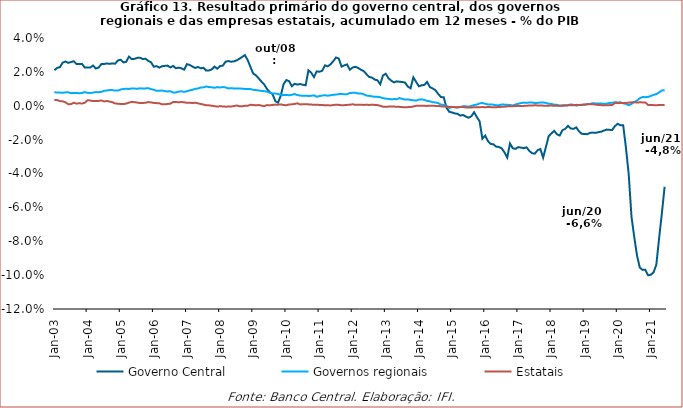
| Category | Governo Central | Governos regionais | Estatais |
|---|---|---|---|
| 2003-01-01 | 0.021 | 0.008 | 0.003 |
| 2003-02-01 | 0.022 | 0.008 | 0.003 |
| 2003-03-01 | 0.023 | 0.008 | 0.003 |
| 2003-04-01 | 0.025 | 0.008 | 0.003 |
| 2003-05-01 | 0.026 | 0.008 | 0.002 |
| 2003-06-01 | 0.025 | 0.008 | 0.001 |
| 2003-07-01 | 0.026 | 0.007 | 0.001 |
| 2003-08-01 | 0.026 | 0.008 | 0.002 |
| 2003-09-01 | 0.025 | 0.008 | 0.001 |
| 2003-10-01 | 0.025 | 0.007 | 0.001 |
| 2003-11-01 | 0.025 | 0.008 | 0.001 |
| 2003-12-01 | 0.023 | 0.008 | 0.002 |
| 2004-01-01 | 0.023 | 0.008 | 0.003 |
| 2004-02-01 | 0.023 | 0.008 | 0.003 |
| 2004-03-01 | 0.024 | 0.008 | 0.003 |
| 2004-04-01 | 0.022 | 0.008 | 0.003 |
| 2004-05-01 | 0.023 | 0.008 | 0.003 |
| 2004-06-01 | 0.025 | 0.008 | 0.003 |
| 2004-07-01 | 0.025 | 0.009 | 0.003 |
| 2004-08-01 | 0.025 | 0.009 | 0.003 |
| 2004-09-01 | 0.025 | 0.009 | 0.002 |
| 2004-10-01 | 0.025 | 0.009 | 0.002 |
| 2004-11-01 | 0.025 | 0.009 | 0.001 |
| 2004-12-01 | 0.027 | 0.009 | 0.001 |
| 2005-01-01 | 0.027 | 0.01 | 0.001 |
| 2005-02-01 | 0.026 | 0.01 | 0.001 |
| 2005-03-01 | 0.026 | 0.01 | 0.001 |
| 2005-04-01 | 0.029 | 0.01 | 0.002 |
| 2005-05-01 | 0.028 | 0.01 | 0.002 |
| 2005-06-01 | 0.028 | 0.01 | 0.002 |
| 2005-07-01 | 0.028 | 0.01 | 0.002 |
| 2005-08-01 | 0.028 | 0.01 | 0.002 |
| 2005-09-01 | 0.028 | 0.01 | 0.002 |
| 2005-10-01 | 0.028 | 0.01 | 0.002 |
| 2005-11-01 | 0.027 | 0.01 | 0.002 |
| 2005-12-01 | 0.026 | 0.01 | 0.002 |
| 2006-01-01 | 0.023 | 0.009 | 0.002 |
| 2006-02-01 | 0.023 | 0.009 | 0.002 |
| 2006-03-01 | 0.023 | 0.009 | 0.002 |
| 2006-04-01 | 0.023 | 0.009 | 0.001 |
| 2006-05-01 | 0.024 | 0.009 | 0.001 |
| 2006-06-01 | 0.024 | 0.008 | 0.001 |
| 2006-07-01 | 0.023 | 0.009 | 0.001 |
| 2006-08-01 | 0.024 | 0.008 | 0.002 |
| 2006-09-01 | 0.022 | 0.008 | 0.002 |
| 2006-10-01 | 0.023 | 0.008 | 0.002 |
| 2006-11-01 | 0.022 | 0.009 | 0.002 |
| 2006-12-01 | 0.021 | 0.008 | 0.002 |
| 2007-01-01 | 0.025 | 0.009 | 0.002 |
| 2007-02-01 | 0.024 | 0.009 | 0.002 |
| 2007-03-01 | 0.023 | 0.009 | 0.002 |
| 2007-04-01 | 0.022 | 0.01 | 0.002 |
| 2007-05-01 | 0.023 | 0.01 | 0.001 |
| 2007-06-01 | 0.022 | 0.011 | 0.001 |
| 2007-07-01 | 0.022 | 0.011 | 0.001 |
| 2007-08-01 | 0.021 | 0.011 | 0 |
| 2007-09-01 | 0.021 | 0.011 | 0 |
| 2007-10-01 | 0.021 | 0.011 | 0 |
| 2007-11-01 | 0.023 | 0.011 | 0 |
| 2007-12-01 | 0.022 | 0.011 | 0 |
| 2008-01-01 | 0.023 | 0.011 | 0 |
| 2008-02-01 | 0.024 | 0.011 | 0 |
| 2008-03-01 | 0.026 | 0.011 | -0.001 |
| 2008-04-01 | 0.026 | 0.01 | -0.001 |
| 2008-05-01 | 0.026 | 0.01 | 0 |
| 2008-06-01 | 0.026 | 0.01 | 0 |
| 2008-07-01 | 0.027 | 0.01 | 0 |
| 2008-08-01 | 0.028 | 0.01 | 0 |
| 2008-09-01 | 0.029 | 0.01 | 0 |
| 2008-10-01 | 0.03 | 0.01 | 0 |
| 2008-11-01 | 0.027 | 0.01 | 0 |
| 2008-12-01 | 0.023 | 0.01 | 0.001 |
| 2009-01-01 | 0.019 | 0.009 | 0 |
| 2009-02-01 | 0.018 | 0.009 | 0 |
| 2009-03-01 | 0.016 | 0.009 | 0 |
| 2009-04-01 | 0.014 | 0.009 | 0 |
| 2009-05-01 | 0.013 | 0.009 | 0 |
| 2009-06-01 | 0.01 | 0.008 | 0 |
| 2009-07-01 | 0.008 | 0.008 | 0 |
| 2009-08-01 | 0.007 | 0.007 | 0 |
| 2009-09-01 | 0.003 | 0.007 | 0.001 |
| 2009-10-01 | 0.002 | 0.007 | 0.001 |
| 2009-11-01 | 0.006 | 0.006 | 0.001 |
| 2009-12-01 | 0.013 | 0.006 | 0 |
| 2010-01-01 | 0.015 | 0.006 | 0 |
| 2010-02-01 | 0.015 | 0.006 | 0.001 |
| 2010-03-01 | 0.012 | 0.006 | 0.001 |
| 2010-04-01 | 0.013 | 0.007 | 0.001 |
| 2010-05-01 | 0.012 | 0.006 | 0.001 |
| 2010-06-01 | 0.013 | 0.006 | 0.001 |
| 2010-07-01 | 0.012 | 0.006 | 0.001 |
| 2010-08-01 | 0.012 | 0.006 | 0.001 |
| 2010-09-01 | 0.021 | 0.006 | 0.001 |
| 2010-10-01 | 0.02 | 0.006 | 0.001 |
| 2010-11-01 | 0.017 | 0.006 | 0.001 |
| 2010-12-01 | 0.02 | 0.005 | 0.001 |
| 2011-01-01 | 0.02 | 0.006 | 0 |
| 2011-02-01 | 0.021 | 0.006 | 0 |
| 2011-03-01 | 0.024 | 0.006 | 0 |
| 2011-04-01 | 0.023 | 0.006 | 0 |
| 2011-05-01 | 0.024 | 0.006 | 0 |
| 2011-06-01 | 0.026 | 0.006 | 0 |
| 2011-07-01 | 0.028 | 0.007 | 0.001 |
| 2011-08-01 | 0.028 | 0.007 | 0.001 |
| 2011-09-01 | 0.023 | 0.007 | 0 |
| 2011-10-01 | 0.024 | 0.007 | 0 |
| 2011-11-01 | 0.024 | 0.007 | 0 |
| 2011-12-01 | 0.021 | 0.008 | 0.001 |
| 2012-01-01 | 0.023 | 0.008 | 0.001 |
| 2012-02-01 | 0.023 | 0.008 | 0.001 |
| 2012-03-01 | 0.022 | 0.007 | 0.001 |
| 2012-04-01 | 0.021 | 0.007 | 0.001 |
| 2012-05-01 | 0.02 | 0.007 | 0 |
| 2012-06-01 | 0.019 | 0.006 | 0.001 |
| 2012-07-01 | 0.017 | 0.006 | 0 |
| 2012-08-01 | 0.017 | 0.006 | 0.001 |
| 2012-09-01 | 0.015 | 0.005 | 0 |
| 2012-10-01 | 0.015 | 0.005 | 0 |
| 2012-11-01 | 0.013 | 0.005 | 0 |
| 2012-12-01 | 0.018 | 0.004 | -0.001 |
| 2013-01-01 | 0.019 | 0.004 | -0.001 |
| 2013-02-01 | 0.016 | 0.004 | -0.001 |
| 2013-03-01 | 0.015 | 0.004 | 0 |
| 2013-04-01 | 0.014 | 0.004 | 0 |
| 2013-05-01 | 0.014 | 0.004 | -0.001 |
| 2013-06-01 | 0.014 | 0.005 | -0.001 |
| 2013-07-01 | 0.014 | 0.004 | -0.001 |
| 2013-08-01 | 0.014 | 0.004 | -0.001 |
| 2013-09-01 | 0.011 | 0.004 | -0.001 |
| 2013-10-01 | 0.01 | 0.003 | -0.001 |
| 2013-11-01 | 0.017 | 0.003 | 0 |
| 2013-12-01 | 0.014 | 0.003 | 0 |
| 2014-01-01 | 0.011 | 0.004 | 0 |
| 2014-02-01 | 0.012 | 0.004 | 0 |
| 2014-03-01 | 0.012 | 0.003 | 0 |
| 2014-04-01 | 0.014 | 0.003 | 0 |
| 2014-05-01 | 0.011 | 0.003 | 0 |
| 2014-06-01 | 0.01 | 0.002 | 0 |
| 2014-07-01 | 0.009 | 0.002 | 0 |
| 2014-08-01 | 0.007 | 0.002 | 0 |
| 2014-09-01 | 0.005 | 0.001 | 0 |
| 2014-10-01 | 0.005 | 0 | 0 |
| 2014-11-01 | -0.001 | 0 | 0 |
| 2014-12-01 | -0.004 | -0.001 | -0.001 |
| 2015-01-01 | -0.004 | -0.001 | -0.001 |
| 2015-02-01 | -0.005 | -0.001 | -0.001 |
| 2015-03-01 | -0.005 | -0.001 | -0.001 |
| 2015-04-01 | -0.006 | -0.001 | -0.001 |
| 2015-05-01 | -0.005 | 0 | -0.001 |
| 2015-06-01 | -0.006 | 0 | -0.001 |
| 2015-07-01 | -0.007 | -0.001 | -0.001 |
| 2015-08-01 | -0.006 | 0 | -0.001 |
| 2015-09-01 | -0.004 | 0 | -0.001 |
| 2015-10-01 | -0.007 | 0.001 | -0.001 |
| 2015-11-01 | -0.009 | 0.001 | -0.001 |
| 2015-12-01 | -0.019 | 0.002 | -0.001 |
| 2016-01-01 | -0.018 | 0.001 | -0.001 |
| 2016-02-01 | -0.021 | 0.001 | -0.001 |
| 2016-03-01 | -0.023 | 0.001 | -0.001 |
| 2016-04-01 | -0.023 | 0.001 | -0.001 |
| 2016-05-01 | -0.024 | 0 | -0.001 |
| 2016-06-01 | -0.024 | 0 | -0.001 |
| 2016-07-01 | -0.025 | 0.001 | -0.001 |
| 2016-08-01 | -0.028 | 0.001 | -0.001 |
| 2016-09-01 | -0.031 | 0.001 | 0 |
| 2016-10-01 | -0.022 | 0 | 0 |
| 2016-11-01 | -0.025 | 0 | 0 |
| 2016-12-01 | -0.025 | 0.001 | 0 |
| 2017-01-01 | -0.024 | 0.001 | 0 |
| 2017-02-01 | -0.025 | 0.002 | 0 |
| 2017-03-01 | -0.025 | 0.002 | 0 |
| 2017-04-01 | -0.025 | 0.002 | 0 |
| 2017-05-01 | -0.027 | 0.002 | 0 |
| 2017-06-01 | -0.028 | 0.002 | 0 |
| 2017-07-01 | -0.028 | 0.002 | 0 |
| 2017-08-01 | -0.026 | 0.002 | 0 |
| 2017-09-01 | -0.026 | 0.002 | 0 |
| 2017-10-01 | -0.031 | 0.002 | 0 |
| 2017-11-01 | -0.024 | 0.002 | 0 |
| 2017-12-01 | -0.018 | 0.001 | 0 |
| 2018-01-01 | -0.016 | 0.001 | 0 |
| 2018-02-01 | -0.015 | 0.001 | 0 |
| 2018-03-01 | -0.017 | 0.001 | 0 |
| 2018-04-01 | -0.018 | 0 | 0 |
| 2018-05-01 | -0.014 | 0 | 0 |
| 2018-06-01 | -0.014 | 0 | 0 |
| 2018-07-01 | -0.012 | 0 | 0 |
| 2018-08-01 | -0.013 | 0.001 | 0 |
| 2018-09-01 | -0.014 | 0.001 | 0 |
| 2018-10-01 | -0.013 | 0 | 0.001 |
| 2018-11-01 | -0.015 | 0 | 0 |
| 2018-12-01 | -0.017 | 0 | 0.001 |
| 2019-01-01 | -0.017 | 0.001 | 0.001 |
| 2019-02-01 | -0.017 | 0.001 | 0.001 |
| 2019-03-01 | -0.016 | 0.001 | 0.001 |
| 2019-04-01 | -0.016 | 0.002 | 0.001 |
| 2019-05-01 | -0.016 | 0.001 | 0.001 |
| 2019-06-01 | -0.016 | 0.001 | 0 |
| 2019-07-01 | -0.015 | 0.001 | 0 |
| 2019-08-01 | -0.015 | 0.001 | 0 |
| 2019-09-01 | -0.014 | 0.001 | 0 |
| 2019-10-01 | -0.014 | 0.002 | 0 |
| 2019-11-01 | -0.014 | 0.002 | 0 |
| 2019-12-01 | -0.012 | 0.002 | 0.002 |
| 2020-01-01 | -0.011 | 0.002 | 0.002 |
| 2020-02-01 | -0.011 | 0.002 | 0.002 |
| 2020-03-01 | -0.012 | 0.001 | 0.002 |
| 2020-04-01 | -0.025 | 0.001 | 0.002 |
| 2020-05-01 | -0.041 | 0 | 0.002 |
| 2020-06-01 | -0.066 | 0.001 | 0.002 |
| 2020-07-01 | -0.077 | 0.002 | 0.002 |
| 2020-08-01 | -0.088 | 0.003 | 0.002 |
| 2020-09-01 | -0.096 | 0.004 | 0.002 |
| 2020-10-01 | -0.097 | 0.005 | 0.002 |
| 2020-11-01 | -0.097 | 0.005 | 0.002 |
| 2020-12-01 | -0.1 | 0.005 | 0 |
| 2021-01-01 | -0.1 | 0.006 | 0 |
| 2021-02-01 | -0.098 | 0.006 | 0 |
| 2021-03-01 | -0.094 | 0.007 | 0 |
| 2021-04-01 | -0.078 | 0.008 | 0 |
| 2021-05-01 | -0.064 | 0.009 | 0 |
| 2021-06-01 | -0.048 | 0.009 | 0 |